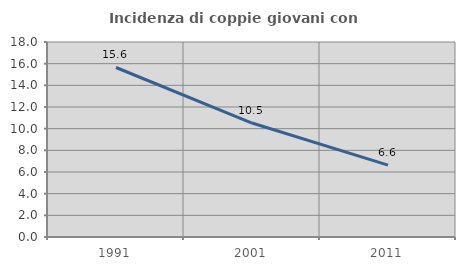
| Category | Incidenza di coppie giovani con figli |
|---|---|
| 1991.0 | 15.646 |
| 2001.0 | 10.519 |
| 2011.0 | 6.634 |